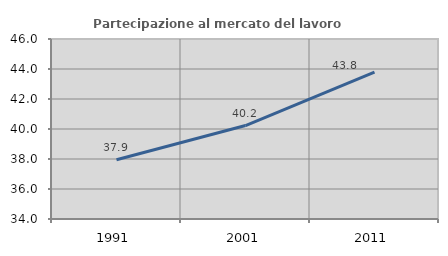
| Category | Partecipazione al mercato del lavoro  femminile |
|---|---|
| 1991.0 | 37.946 |
| 2001.0 | 40.228 |
| 2011.0 | 43.785 |